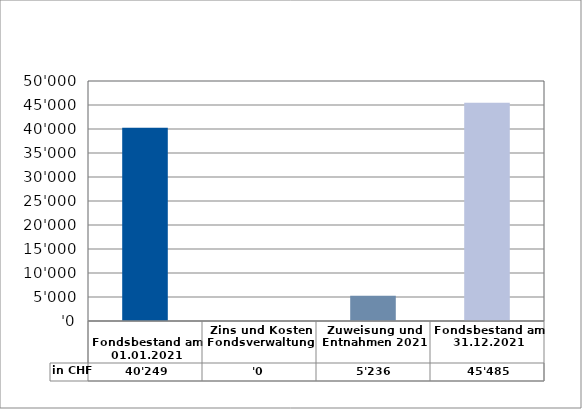
| Category | in CHF |
|---|---|
| 
Fondsbestand am 01.01.2021

 | 40249 |
| Zins und Kosten Fondsverwaltung | 0 |
| Zuweisung und Entnahmen 2021 | 5235.75 |
| Fondsbestand am 31.12.2021 | 45484.75 |